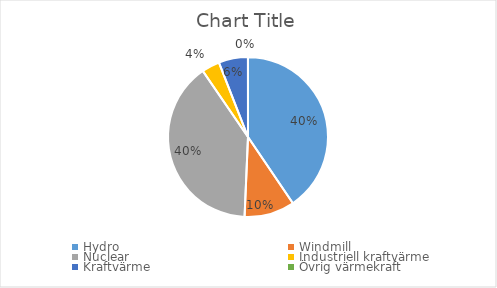
| Category | Series 0 |
|---|---|
| Hydro | 61709382324 |
| Windmill | 15479411857.7 |
| Nuclear | 60541530000 |
| Industriell kraftvärme | 5526787565 |
| Kraftvärme | 9012499851.2 |
| Övrig värmekraft | 16482200 |